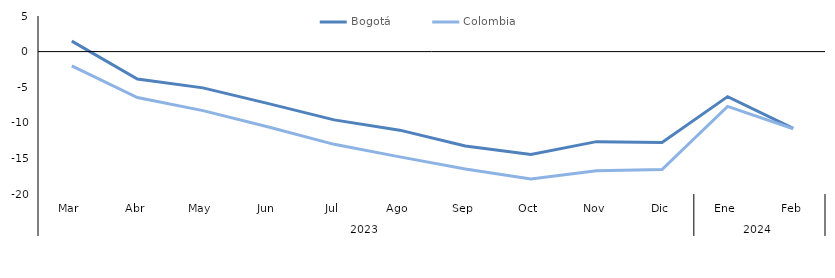
| Category | Bogotá | Colombia |
|---|---|---|
| 0 | 1.475 | -2.013 |
| 1 | -3.854 | -6.457 |
| 2 | -5.095 | -8.288 |
| 3 | -7.308 | -10.6 |
| 4 | -9.59 | -13.025 |
| 5 | -11.034 | -14.788 |
| 6 | -13.258 | -16.486 |
| 7 | -14.451 | -17.889 |
| 8 | -12.647 | -16.73 |
| 9 | -12.757 | -16.574 |
| 10 | -6.323 | -7.694 |
| 11 | -10.77 | -10.836 |